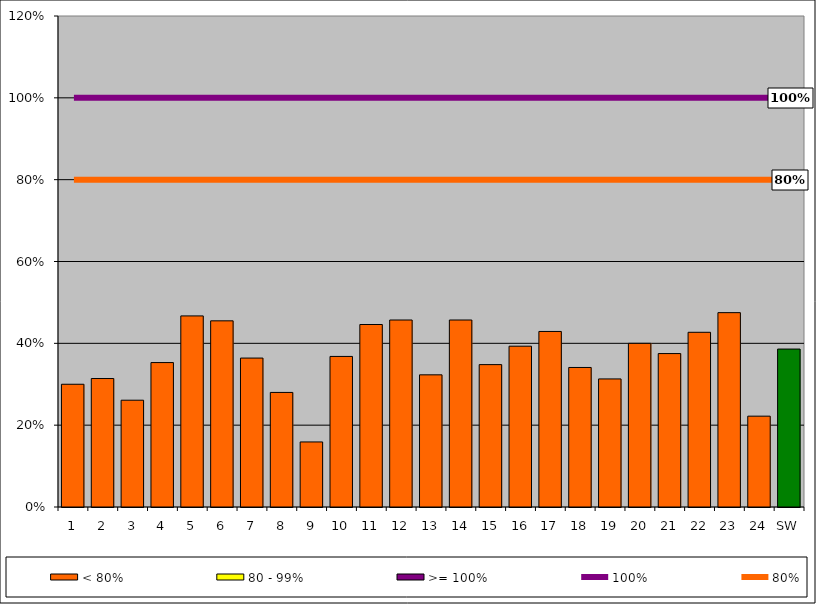
| Category | < 80% | 80 - 99% | >= 100% |
|---|---|---|---|
| 1 | 0.3 | 0 | 0 |
| 2 | 0.314 | 0 | 0 |
| 3 | 0.261 | 0 | 0 |
| 4 | 0.353 | 0 | 0 |
| 5 | 0.467 | 0 | 0 |
| 6 | 0.455 | 0 | 0 |
| 7 | 0.364 | 0 | 0 |
| 8 | 0.28 | 0 | 0 |
| 9 | 0.159 | 0 | 0 |
| 10 | 0.368 | 0 | 0 |
| 11 | 0.446 | 0 | 0 |
| 12 | 0.457 | 0 | 0 |
| 13 | 0.323 | 0 | 0 |
| 14 | 0.457 | 0 | 0 |
| 15 | 0.348 | 0 | 0 |
| 16 | 0.393 | 0 | 0 |
| 17 | 0.429 | 0 | 0 |
| 18 | 0.341 | 0 | 0 |
| 19 | 0.313 | 0 | 0 |
| 20 | 0.4 | 0 | 0 |
| 21 | 0.375 | 0 | 0 |
| 22 | 0.427 | 0 | 0 |
| 23 | 0.475 | 0 | 0 |
| 24 | 0.222 | 0 | 0 |
| SW | 0.386 | 0 | 0 |